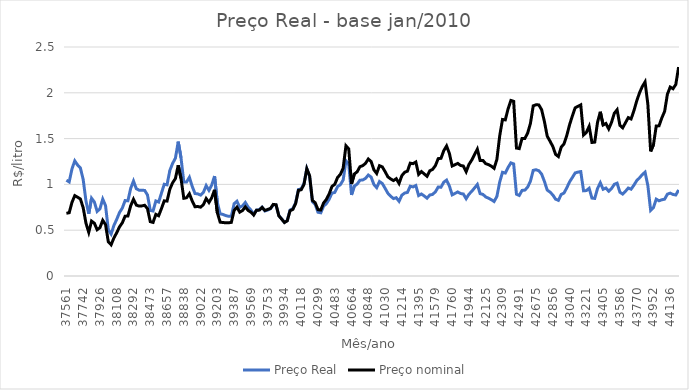
| Category | Preço Real | Preço nominal |
|---|---|---|
| 37561.0 | 1.046 | 0.685 |
| 37591.0 | 1.027 | 0.691 |
| 37622.0 | 1.17 | 0.804 |
| 37653.0 | 1.257 | 0.878 |
| 37681.0 | 1.212 | 0.86 |
| 37712.0 | 1.18 | 0.841 |
| 37742.0 | 1.054 | 0.746 |
| 37773.0 | 0.82 | 0.576 |
| 37803.0 | 0.679 | 0.476 |
| 37834.0 | 0.849 | 0.6 |
| 37865.0 | 0.808 | 0.577 |
| 37895.0 | 0.705 | 0.505 |
| 37926.0 | 0.733 | 0.528 |
| 37956.0 | 0.84 | 0.608 |
| 37987.0 | 0.769 | 0.561 |
| 38018.0 | 0.505 | 0.373 |
| 38047.0 | 0.458 | 0.341 |
| 38078.0 | 0.552 | 0.416 |
| 38108.0 | 0.618 | 0.473 |
| 38139.0 | 0.693 | 0.536 |
| 38169.0 | 0.741 | 0.581 |
| 38200.0 | 0.823 | 0.653 |
| 38231.0 | 0.821 | 0.654 |
| 38261.0 | 0.957 | 0.767 |
| 38292.0 | 1.037 | 0.838 |
| 38322.0 | 0.953 | 0.774 |
| 38353.0 | 0.937 | 0.763 |
| 38384.0 | 0.936 | 0.766 |
| 38412.0 | 0.935 | 0.772 |
| 38443.0 | 0.885 | 0.735 |
| 38473.0 | 0.716 | 0.593 |
| 38504.0 | 0.709 | 0.585 |
| 38534.0 | 0.819 | 0.673 |
| 38565.0 | 0.807 | 0.658 |
| 38596.0 | 0.904 | 0.736 |
| 38626.0 | 1.002 | 0.82 |
| 38657.0 | 0.996 | 0.818 |
| 38687.0 | 1.152 | 0.947 |
| 38718.0 | 1.23 | 1.018 |
| 38749.0 | 1.286 | 1.064 |
| 38777.0 | 1.467 | 1.208 |
| 38808.0 | 1.291 | 1.064 |
| 38838.0 | 1.026 | 0.849 |
| 38869.0 | 1.026 | 0.855 |
| 38899.0 | 1.077 | 0.898 |
| 38930.0 | 0.979 | 0.82 |
| 38961.0 | 0.901 | 0.756 |
| 38991.0 | 0.896 | 0.759 |
| 39022.0 | 0.883 | 0.752 |
| 39052.0 | 0.912 | 0.778 |
| 39083.0 | 0.987 | 0.845 |
| 39114.0 | 0.935 | 0.803 |
| 39142.0 | 0.993 | 0.855 |
| 39173.0 | 1.091 | 0.94 |
| 39203.0 | 0.8 | 0.691 |
| 39234.0 | 0.679 | 0.588 |
| 39264.0 | 0.672 | 0.584 |
| 39295.0 | 0.66 | 0.581 |
| 39326.0 | 0.652 | 0.581 |
| 39356.0 | 0.652 | 0.586 |
| 39387.0 | 0.789 | 0.716 |
| 39417.0 | 0.816 | 0.751 |
| 39448.0 | 0.75 | 0.697 |
| 39479.0 | 0.766 | 0.715 |
| 39508.0 | 0.803 | 0.755 |
| 39539.0 | 0.753 | 0.716 |
| 39569.0 | 0.72 | 0.697 |
| 39600.0 | 0.674 | 0.665 |
| 39630.0 | 0.72 | 0.718 |
| 39661.0 | 0.724 | 0.719 |
| 39692.0 | 0.752 | 0.75 |
| 39722.0 | 0.71 | 0.716 |
| 39753.0 | 0.72 | 0.726 |
| 39783.0 | 0.734 | 0.738 |
| 39814.0 | 0.778 | 0.781 |
| 39845.0 | 0.775 | 0.778 |
| 39873.0 | 0.66 | 0.657 |
| 39904.0 | 0.624 | 0.621 |
| 39934.0 | 0.586 | 0.584 |
| 39965.0 | 0.606 | 0.602 |
| 39995.0 | 0.721 | 0.712 |
| 40026.0 | 0.735 | 0.726 |
| 40057.0 | 0.799 | 0.791 |
| 40087.0 | 0.944 | 0.935 |
| 40118.0 | 0.95 | 0.942 |
| 40148.0 | 1.01 | 1 |
| 40179.0 | 1.171 | 1.171 |
| 40210.0 | 1.084 | 1.096 |
| 40238.0 | 0.811 | 0.825 |
| 40269.0 | 0.78 | 0.8 |
| 40299.0 | 0.696 | 0.724 |
| 40330.0 | 0.69 | 0.72 |
| 40360.0 | 0.762 | 0.798 |
| 40391.0 | 0.79 | 0.836 |
| 40422.0 | 0.838 | 0.896 |
| 40452.0 | 0.905 | 0.978 |
| 40483.0 | 0.912 | 1.001 |
| 40513.0 | 0.976 | 1.075 |
| 40544.0 | 0.997 | 1.109 |
| 40575.0 | 1.047 | 1.176 |
| 40603.0 | 1.258 | 1.422 |
| 40634.0 | 1.222 | 1.388 |
| 40664.0 | 0.886 | 1.006 |
| 40695.0 | 0.982 | 1.114 |
| 40725.0 | 1.003 | 1.137 |
| 40756.0 | 1.046 | 1.193 |
| 40787.0 | 1.048 | 1.205 |
| 40817.0 | 1.066 | 1.23 |
| 40848.0 | 1.102 | 1.277 |
| 40878.0 | 1.081 | 1.25 |
| 40909.0 | 0.999 | 1.159 |
| 40940.0 | 0.964 | 1.12 |
| 40969.0 | 1.031 | 1.204 |
| 41000.0 | 1.01 | 1.191 |
| 41030.0 | 0.958 | 1.14 |
| 41061.0 | 0.903 | 1.083 |
| 41091.0 | 0.871 | 1.06 |
| 41122.0 | 0.845 | 1.042 |
| 41153.0 | 0.855 | 1.062 |
| 41183.0 | 0.815 | 1.011 |
| 41214.0 | 0.882 | 1.096 |
| 41244.0 | 0.906 | 1.132 |
| 41275.0 | 0.912 | 1.145 |
| 41306.0 | 0.98 | 1.232 |
| 41334.0 | 0.973 | 1.226 |
| 41365.0 | 0.987 | 1.244 |
| 41395.0 | 0.878 | 1.11 |
| 41426.0 | 0.895 | 1.14 |
| 41456.0 | 0.874 | 1.114 |
| 41487.0 | 0.85 | 1.089 |
| 41518.0 | 0.884 | 1.148 |
| 41548.0 | 0.891 | 1.164 |
| 41579.0 | 0.919 | 1.205 |
| 41609.0 | 0.971 | 1.281 |
| 41640.0 | 0.97 | 1.285 |
| 41671.0 | 1.024 | 1.369 |
| 41699.0 | 1.047 | 1.42 |
| 41730.0 | 0.983 | 1.338 |
| 41760.0 | 0.886 | 1.201 |
| 41791.0 | 0.902 | 1.215 |
| 41821.0 | 0.917 | 1.229 |
| 41852.0 | 0.9 | 1.207 |
| 41883.0 | 0.895 | 1.201 |
| 41913.0 | 0.844 | 1.138 |
| 41944.0 | 0.893 | 1.218 |
| 41974.0 | 0.924 | 1.266 |
| 42005.0 | 0.961 | 1.326 |
| 42036.0 | 0.999 | 1.385 |
| 42064.0 | 0.899 | 1.261 |
| 42095.0 | 0.891 | 1.262 |
| 42125.0 | 0.863 | 1.226 |
| 42156.0 | 0.85 | 1.216 |
| 42186.0 | 0.833 | 1.199 |
| 42217.0 | 0.813 | 1.176 |
| 42248.0 | 0.869 | 1.273 |
| 42278.0 | 1.025 | 1.529 |
| 42309.0 | 1.132 | 1.709 |
| 42339.0 | 1.124 | 1.705 |
| 42370.0 | 1.185 | 1.824 |
| 42401.0 | 1.235 | 1.916 |
| 42430.0 | 1.224 | 1.907 |
| 42461.0 | 0.893 | 1.397 |
| 42491.0 | 0.879 | 1.391 |
| 42522.0 | 0.934 | 1.502 |
| 42552.0 | 0.938 | 1.502 |
| 42583.0 | 0.97 | 1.56 |
| 42614.0 | 1.036 | 1.666 |
| 42644.0 | 1.153 | 1.858 |
| 42675.0 | 1.16 | 1.869 |
| 42705.0 | 1.149 | 1.868 |
| 42736.0 | 1.113 | 1.816 |
| 42767.0 | 1.032 | 1.686 |
| 42795.0 | 0.938 | 1.526 |
| 42826.0 | 0.916 | 1.472 |
| 42856.0 | 0.885 | 1.414 |
| 42887.0 | 0.839 | 1.328 |
| 42917.0 | 0.826 | 1.304 |
| 42948.0 | 0.89 | 1.406 |
| 42979.0 | 0.906 | 1.442 |
| 43009.0 | 0.963 | 1.534 |
| 43040.0 | 1.028 | 1.651 |
| 43070.0 | 1.076 | 1.748 |
| 43101.0 | 1.125 | 1.836 |
| 43132.0 | 1.134 | 1.852 |
| 43160.0 | 1.14 | 1.868 |
| 43191.0 | 0.93 | 1.539 |
| 43221.0 | 0.932 | 1.568 |
| 43252.0 | 0.957 | 1.634 |
| 43282.0 | 0.851 | 1.458 |
| 43313.0 | 0.847 | 1.462 |
| 43344.0 | 0.955 | 1.678 |
| 43374.0 | 1.018 | 1.793 |
| 43405.0 | 0.947 | 1.649 |
| 43435.0 | 0.961 | 1.665 |
| 43466.0 | 0.926 | 1.606 |
| 43497.0 | 0.955 | 1.677 |
| 43525.0 | 1.001 | 1.776 |
| 43556.0 | 1.013 | 1.815 |
| 43586.0 | 0.915 | 1.645 |
| 43617.0 | 0.894 | 1.618 |
| 43647.0 | 0.925 | 1.674 |
| 43678.0 | 0.961 | 1.729 |
| 43709.0 | 0.948 | 1.715 |
| 43739.0 | 0.991 | 1.803 |
| 43770.0 | 1.041 | 1.909 |
| 43800.0 | 1.071 | 1.998 |
| 43831.0 | 1.107 | 2.068 |
| 43862.0 | 1.134 | 2.118 |
| 43891.0 | 0.987 | 1.875 |
| 43922.0 | 0.716 | 1.361 |
| 43952.0 | 0.746 | 1.432 |
| 43983.0 | 0.839 | 1.637 |
| 44013.0 | 0.821 | 1.64 |
| 44044.0 | 0.832 | 1.726 |
| 44075.0 | 0.839 | 1.797 |
| 44105.0 | 0.894 | 1.985 |
| 44136.0 | 0.905 | 2.063 |
| 44166.0 | 0.89 | 2.044 |
| 44197.0 | 0.884 | 2.091 |
| 44228.0 | 0.939 | 2.281 |